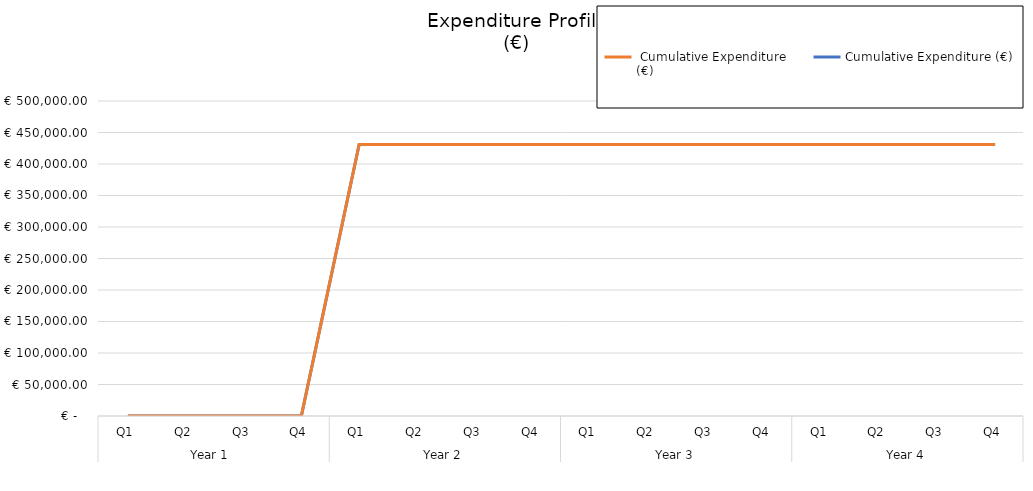
| Category | Cumulative Expenditure (€) |  Cumulative Expenditure 
(€) |
|---|---|---|
| 0 | 0 | 0 |
| 1 | 0 | 0 |
| 2 | 0 | 0 |
| 3 | 0 | 0 |
| 4 | 430963.97 | 0 |
| 5 | 430963.97 | 0 |
| 6 | 430963.97 | 0 |
| 7 | 430963.97 | 0 |
| 8 | 430963.97 | 0 |
| 9 | 430963.97 | 0 |
| 10 | 430963.97 | 0 |
| 11 | 430963.97 | 0 |
| 12 | 430963.97 | 0 |
| 13 | 430963.97 | 0 |
| 14 | 430963.97 | 0 |
| 15 | 430963.97 | 0 |